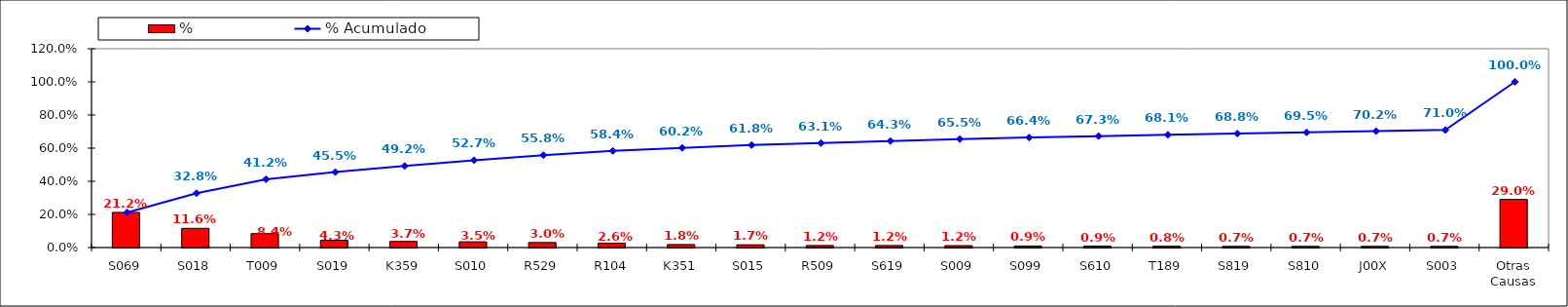
| Category | % |
|---|---|
| S069 | 0.212 |
| S018 | 0.116 |
| T009 | 0.084 |
| S019 | 0.043 |
| K359 | 0.037 |
| S010 | 0.035 |
| R529 | 0.03 |
| R104 | 0.026 |
| K351 | 0.018 |
| S015 | 0.017 |
| R509 | 0.012 |
| S619 | 0.012 |
| S009 | 0.012 |
| S099 | 0.009 |
| S610 | 0.009 |
| T189 | 0.008 |
| S819 | 0.007 |
| S810 | 0.007 |
| J00X | 0.007 |
| S003 | 0.007 |
| Otras Causas | 0.29 |